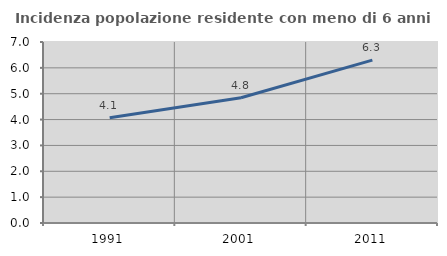
| Category | Incidenza popolazione residente con meno di 6 anni |
|---|---|
| 1991.0 | 4.069 |
| 2001.0 | 4.843 |
| 2011.0 | 6.301 |